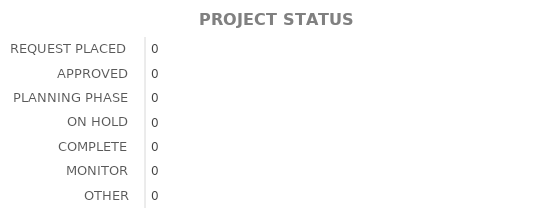
| Category | QTY |
|---|---|
| REQUEST PLACED | 0 |
| APPROVED | 0 |
| PLANNING PHASE | 0 |
| ON HOLD | 0 |
| COMPLETE | 0 |
| MONITOR | 0 |
| OTHER | 0 |